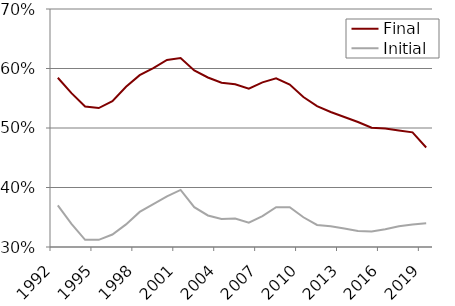
| Category | Final | Initial |
|---|---|---|
| 1992.0 | 0.584 | 0.37 |
| 1993.0 | 0.559 | 0.339 |
| 1994.0 | 0.536 | 0.312 |
| 1995.0 | 0.534 | 0.312 |
| 1996.0 | 0.545 | 0.321 |
| 1997.0 | 0.569 | 0.338 |
| 1998.0 | 0.589 | 0.359 |
| 1999.0 | 0.601 | 0.372 |
| 2000.0 | 0.614 | 0.385 |
| 2001.0 | 0.618 | 0.396 |
| 2002.0 | 0.597 | 0.367 |
| 2003.0 | 0.585 | 0.353 |
| 2004.0 | 0.576 | 0.347 |
| 2005.0 | 0.574 | 0.348 |
| 2006.0 | 0.566 | 0.341 |
| 2007.0 | 0.577 | 0.352 |
| 2008.0 | 0.583 | 0.367 |
| 2009.0 | 0.573 | 0.367 |
| 2010.0 | 0.552 | 0.35 |
| 2011.0 | 0.537 | 0.337 |
| 2012.0 | 0.527 | 0.335 |
| 2013.0 | 0.519 | 0.331 |
| 2014.0 | 0.51 | 0.327 |
| 2015.0 | 0.5 | 0.326 |
| 2016.0 | 0.499 | 0.33 |
| 2017.0 | 0.496 | 0.335 |
| 2018.0 | 0.493 | 0.338 |
| 2019.0 | 0.467 | 0.34 |